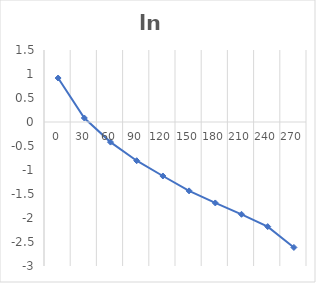
| Category | logvelocità |
|---|---|
| 0.0 | 0.916 |
| 30.0 | 0.083 |
| 60.0 | -0.419 |
| 90.0 | -0.806 |
| 120.0 | -1.125 |
| 150.0 | -1.435 |
| 180.0 | -1.686 |
| 210.0 | -1.923 |
| 240.0 | -2.179 |
| 270.0 | -2.613 |